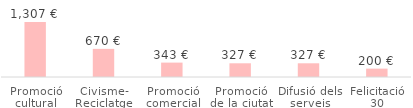
| Category | Total |
|---|---|
| Promoció cultural | 1306.8 |
| Civisme- Reciclatge | 669.74 |
| Promoció comercial | 343.04 |
| Promoció de la ciutat | 326.7 |
| Difusió dels serveis | 326.7 |
| Felicitació 30 aniversari | 199.65 |